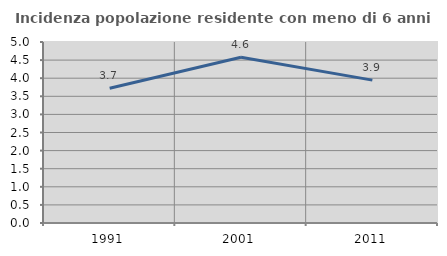
| Category | Incidenza popolazione residente con meno di 6 anni |
|---|---|
| 1991.0 | 3.723 |
| 2001.0 | 4.577 |
| 2011.0 | 3.947 |